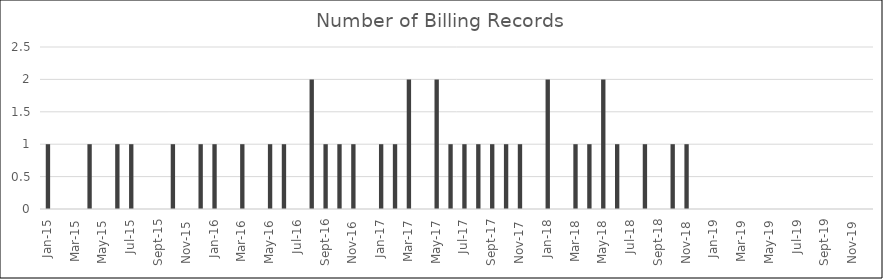
| Category | Num Records |
|---|---|
| 2015-01-01 | 1 |
| 2015-02-01 | 0 |
| 2015-03-01 | 0 |
| 2015-04-01 | 1 |
| 2015-05-01 | 0 |
| 2015-06-01 | 1 |
| 2015-07-01 | 1 |
| 2015-08-01 | 0 |
| 2015-09-01 | 0 |
| 2015-10-01 | 1 |
| 2015-11-01 | 0 |
| 2015-12-01 | 1 |
| 2016-01-01 | 1 |
| 2016-02-01 | 0 |
| 2016-03-01 | 1 |
| 2016-04-01 | 0 |
| 2016-05-01 | 1 |
| 2016-06-01 | 1 |
| 2016-07-01 | 0 |
| 2016-08-01 | 2 |
| 2016-09-01 | 1 |
| 2016-10-01 | 1 |
| 2016-11-01 | 1 |
| 2016-12-01 | 0 |
| 2017-01-01 | 1 |
| 2017-02-01 | 1 |
| 2017-03-01 | 2 |
| 2017-04-01 | 0 |
| 2017-05-01 | 2 |
| 2017-06-01 | 1 |
| 2017-07-01 | 1 |
| 2017-08-01 | 1 |
| 2017-09-01 | 1 |
| 2017-10-01 | 1 |
| 2017-11-01 | 1 |
| 2017-12-01 | 0 |
| 2018-01-01 | 2 |
| 2018-02-01 | 0 |
| 2018-03-01 | 1 |
| 2018-04-01 | 1 |
| 2018-05-01 | 2 |
| 2018-06-01 | 1 |
| 2018-07-01 | 0 |
| 2018-08-01 | 1 |
| 2018-09-01 | 0 |
| 2018-10-01 | 1 |
| 2018-11-01 | 1 |
| 2018-12-01 | 0 |
| 2019-01-01 | 0 |
| 2019-02-01 | 0 |
| 2019-03-01 | 0 |
| 2019-04-01 | 0 |
| 2019-05-01 | 0 |
| 2019-06-01 | 0 |
| 2019-07-01 | 0 |
| 2019-08-01 | 0 |
| 2019-09-01 | 0 |
| 2019-10-01 | 0 |
| 2019-11-01 | 0 |
| 2019-12-01 | 0 |